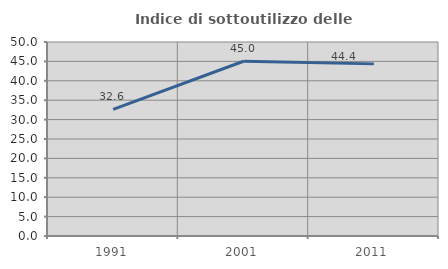
| Category | Indice di sottoutilizzo delle abitazioni  |
|---|---|
| 1991.0 | 32.615 |
| 2001.0 | 45.033 |
| 2011.0 | 44.362 |